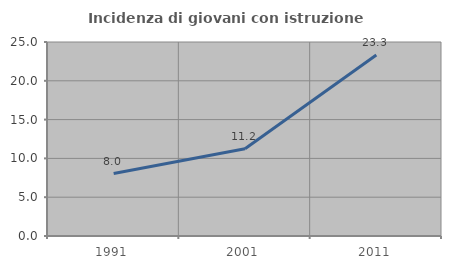
| Category | Incidenza di giovani con istruzione universitaria |
|---|---|
| 1991.0 | 8.044 |
| 2001.0 | 11.247 |
| 2011.0 | 23.326 |